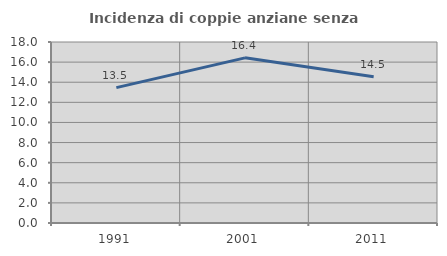
| Category | Incidenza di coppie anziane senza figli  |
|---|---|
| 1991.0 | 13.462 |
| 2001.0 | 16.423 |
| 2011.0 | 14.539 |